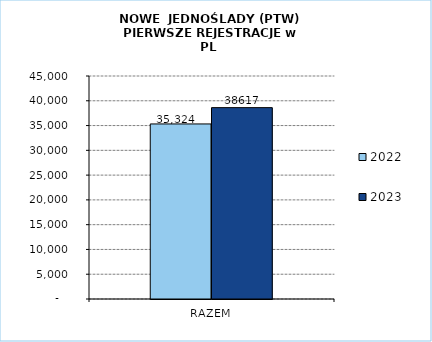
| Category | 2022 | 2023 |
|---|---|---|
| RAZEM | 35324 | 38617 |